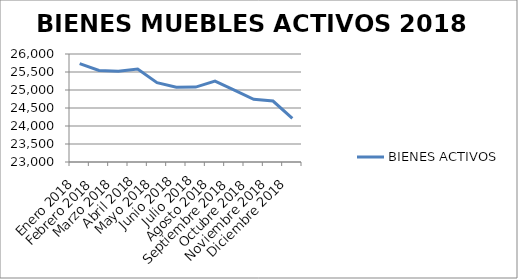
| Category | BIENES ACTIVOS |
|---|---|
| Enero 2018 | 25731 |
| Febrero 2018 | 25541 |
| Marzo 2018 | 25524 |
| Abril 2018 | 25585 |
| Mayo 2018 | 25204 |
| Junio 2018 | 25079 |
| Julio 2018 | 25080 |
| Agosto 2018 | 25245 |
| Septiembre 2018 | 24997 |
| Octubre 2018 | 24740 |
| Noviembre 2018 | 24693 |
| Diciembre 2018 | 24211 |